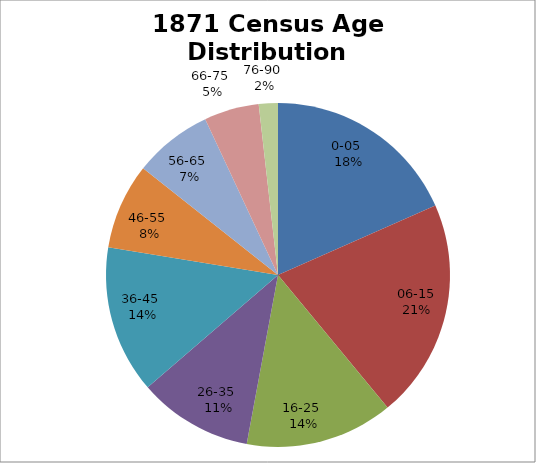
| Category | Series 1 |
|---|---|
| 0-05  | 82 |
| 06-15 | 92 |
| 16-25  | 62 |
| 26-35  | 48 |
| 36-45  | 62 |
| 46-55  | 36 |
| 56-65  | 33 |
| 66-75  | 23 |
| 76-90  | 8 |